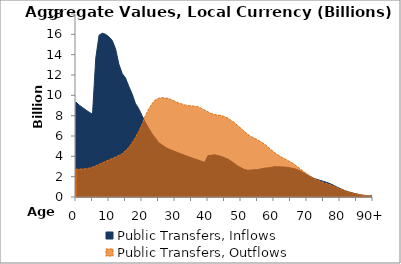
| Category | Public Transfers, Inflows | Public Transfers, Outflows |
|---|---|---|
| 0 | 9334.047 | 2724.083 |
|  | 9031.409 | 2743.176 |
| 2 | 8797.724 | 2755.482 |
| 3 | 8561.741 | 2783.081 |
| 4 | 8336.154 | 2840.822 |
| 5 | 8148.171 | 2936.271 |
| 6 | 13683.006 | 3066.845 |
| 7 | 15926.485 | 3211.076 |
| 8 | 16112.091 | 3359.366 |
| 9 | 15996.22 | 3508.02 |
| 10 | 15748.974 | 3656.277 |
| 11 | 15392.788 | 3791.268 |
| 12 | 14557.609 | 3933.792 |
| 13 | 13060.815 | 4089.356 |
| 14 | 12147.165 | 4254.46 |
| 15 | 11707.902 | 4574.683 |
| 16 | 10889.708 | 4872.091 |
| 17 | 10142.018 | 5346.249 |
| 18 | 9212.589 | 5849.799 |
| 19 | 8698.849 | 6453.819 |
| 20 | 8013.955 | 7138.743 |
| 21 | 7342.597 | 7982.699 |
| 22 | 6777.608 | 8633.127 |
| 23 | 6238.513 | 9155.853 |
| 24 | 5817.845 | 9542.05 |
| 25 | 5364.739 | 9709.971 |
| 26 | 5137.064 | 9775.703 |
| 27 | 4910.002 | 9738.488 |
| 28 | 4734.224 | 9695.215 |
| 29 | 4605.293 | 9545.17 |
| 30 | 4473.403 | 9411.595 |
| 31 | 4344.704 | 9266.835 |
| 32 | 4223.961 | 9161.579 |
| 33 | 4102.03 | 9048.336 |
| 34 | 3975.396 | 8988.135 |
| 35 | 3859.769 | 8963.458 |
| 36 | 3744.84 | 8920.304 |
| 37 | 3631.867 | 8869.081 |
| 38 | 3519.835 | 8716.626 |
| 39 | 3412.69 | 8548.741 |
| 40 | 4071.547 | 8369.006 |
| 41 | 4100.81 | 8216.741 |
| 42 | 4162.425 | 8107.9 |
| 43 | 4078.156 | 8053.471 |
| 44 | 3986.013 | 8014.702 |
| 45 | 3869.841 | 7902.616 |
| 46 | 3733.107 | 7765.713 |
| 47 | 3519.268 | 7526.29 |
| 48 | 3290.808 | 7326.541 |
| 49 | 3053.335 | 7027.735 |
| 50 | 2872.381 | 6753.171 |
| 51 | 2714.825 | 6443.365 |
| 52 | 2635.722 | 6183.31 |
| 53 | 2648.263 | 5951.714 |
| 54 | 2680.812 | 5799.196 |
| 55 | 2685.269 | 5623.217 |
| 56 | 2766.335 | 5440.332 |
| 57 | 2830.931 | 5230.215 |
| 58 | 2864.668 | 4969.981 |
| 59 | 2904.744 | 4677.442 |
| 60 | 2970.853 | 4417.089 |
| 61 | 2974.167 | 4179.026 |
| 62 | 2968.428 | 3981.786 |
| 63 | 2952.833 | 3795.454 |
| 64 | 2925.934 | 3623.85 |
| 65 | 2864.176 | 3437.468 |
| 66 | 2796.246 | 3255.693 |
| 67 | 2697.022 | 3004.62 |
| 68 | 2556.931 | 2753.4 |
| 69 | 2377.197 | 2501.027 |
| 70 | 2200.46 | 2261.267 |
| 71 | 2013.553 | 2027.613 |
| 72 | 1851.749 | 1827.318 |
| 73 | 1728.465 | 1665.581 |
| 74 | 1638.356 | 1541.963 |
| 75 | 1536.818 | 1424.022 |
| 76 | 1434.467 | 1319.096 |
| 77 | 1310.969 | 1204.577 |
| 78 | 1160.863 | 1071.275 |
| 79 | 992.875 | 924.172 |
| 80 | 839.904 | 788.287 |
| 81 | 696.026 | 660.052 |
| 82 | 568.823 | 546.697 |
| 83 | 464.195 | 454.333 |
| 84 | 377.712 | 378.332 |
| 85 | 298.405 | 307.252 |
| 86 | 227.864 | 241.855 |
| 87 | 170.436 | 186.309 |
| 88 | 126.783 | 141.228 |
| 89 | 92.588 | 105.211 |
| 90+ | 185.838 | 215.76 |